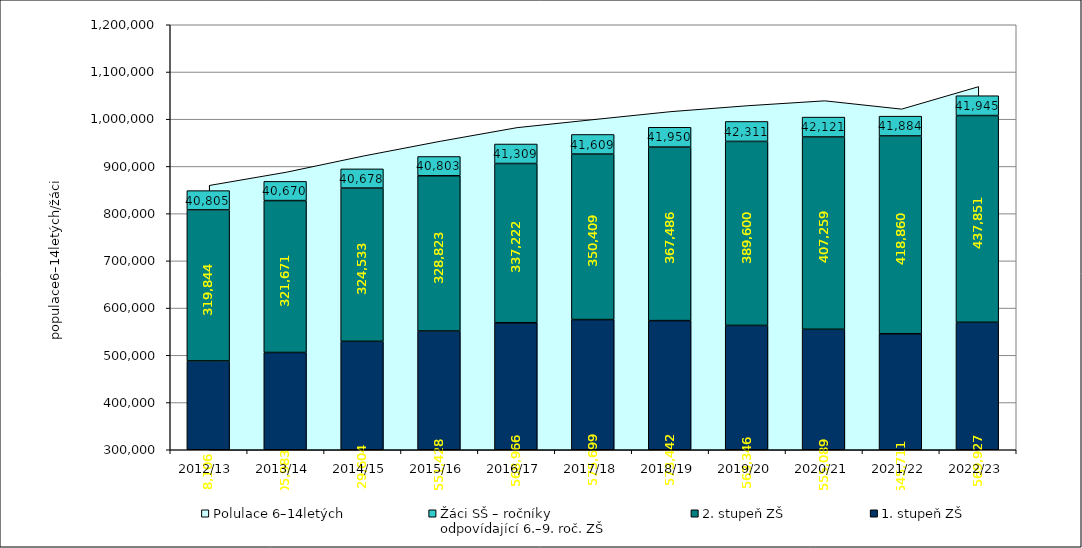
| Category | 1. stupeň ZŠ  | 2. stupeň ZŠ | Žáci SŠ – ročníky
odpovídající 6.–9. roč. ZŠ |
|---|---|---|---|
| 2012/13 | 488106 | 319844 | 40805 |
| 2013/14 | 505983 | 321671 | 40670 |
| 2014/15 | 529604 | 324533 | 40678 |
| 2015/16 | 551428 | 328823 | 40803 |
| 2016/17 | 568966 | 337222 | 41309 |
| 2017/18 | 575699 | 350409 | 41609 |
| 2018/19 | 573442 | 367486 | 41950 |
| 2019/20 | 563346 | 389600 | 42311 |
| 2020/21 | 555089 | 407259 | 42121 |
| 2021/22 | 545711 | 418860 | 41884 |
| 2022/23 | 569927 | 437851 | 41945 |